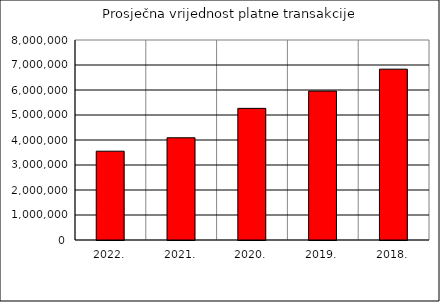
| Category | Prosječna vrijednost platne transakcije |
|---|---|
| 2022. | 3552143.424 |
| 2021. | 4089173.228 |
| 2020. | 5265411.19 |
| 2019. | 5956255.714 |
| 2018. | 6833378.133 |